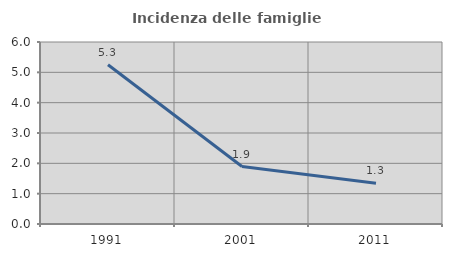
| Category | Incidenza delle famiglie numerose |
|---|---|
| 1991.0 | 5.251 |
| 2001.0 | 1.895 |
| 2011.0 | 1.345 |